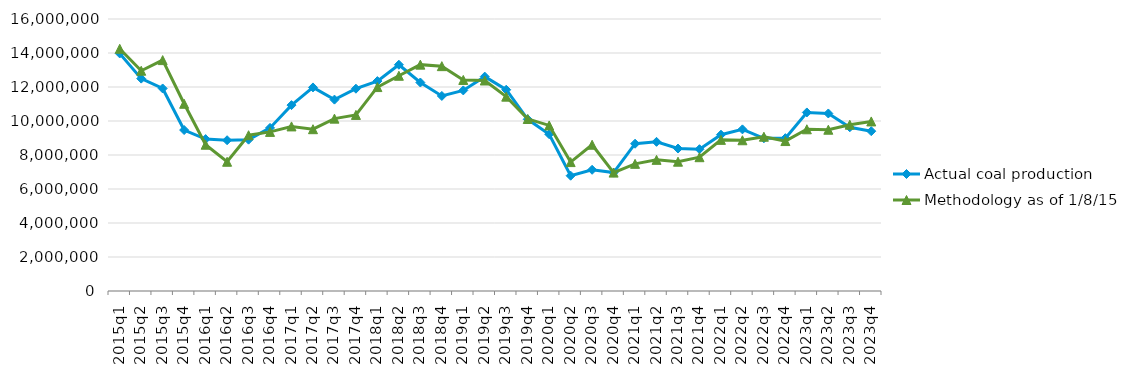
| Category | Actual coal production | Methodology as of 1/8/15 |
|---|---|---|
| 2015q1 | 13972264 | 14247822 |
| 2015q2 | 12493107 | 12956849 |
| 2015q3 | 11914430 | 13582041 |
| 2015q4 | 9467938 | 11013559 |
| 2016q1 | 8934220 | 8604653 |
| 2016q2 | 8868945 | 7602028 |
| 2016q3 | 8901697 | 9162154 |
| 2016q4 | 9593846 | 9359550 |
| 2017q1 | 10934653 | 9681075 |
| 2017q2 | 11974267 | 9517850 |
| 2017q3 | 11257721 | 10139642 |
| 2017q4 | 11900532 | 10358376 |
| 2018q1 | 12346983 | 11995765 |
| 2018q2 | 13310407 | 12661401 |
| 2018q3 | 12264204 | 13315627 |
| 2018q4 | 11473866 | 13226874 |
| 2019q1 | 11797911 | 12414827 |
| 2019q2 | 12610554 | 12382556 |
| 2019q3 | 11838672 | 11432806 |
| 2019q4 | 10099912 | 10117252 |
| 2020q1 | 9224100 | 9739825 |
| 2020q2 | 6781622 | 7582825 |
| 2020q3 | 7129980 | 8604343 |
| 2020q4 | 6964935 | 6964019 |
| 2021q1 | 8663974 | 7479931 |
| 2021q2 | 8774691 | 7714350 |
| 2021q3 | 8380287 | 7606593 |
| 2021q4 | 8340563 | 7871201 |
| 2022q1 | 9194477 | 8889883 |
| 2022q2 | 9507963 | 8867028 |
| 2022q3 | 8983696 | 9075361 |
| 2022q4 | 8991354 | 8820464 |
| 2023q1 | 10502905 | 9512710 |
| 2023q2 | 10442390 | 9486511 |
| 2023q3 | 9631681 | 9781618 |
| 2023q4 | 9400163 | 9974409 |